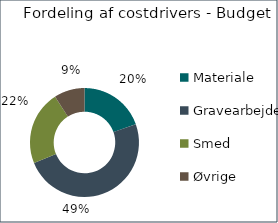
| Category | Series 0 | Andel af budget  |
|---|---|---|
| Materiale  |  | 0.195 |
| Gravearbejde |  | 0.493 |
| Smed |  | 0.221 |
| Øvrige  |  | 0.091 |